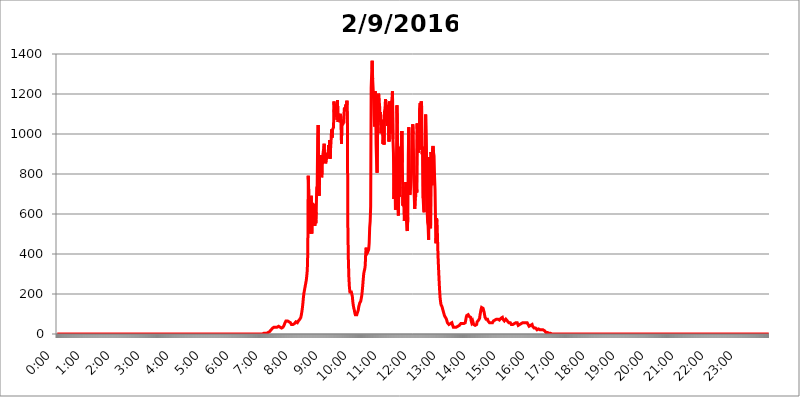
| Category | 2016.02.09 |
|---|---|
| 0.0 | 0 |
| 0.0006944444444444445 | 0 |
| 0.001388888888888889 | 0 |
| 0.0020833333333333333 | 0 |
| 0.002777777777777778 | 0 |
| 0.003472222222222222 | 0 |
| 0.004166666666666667 | 0 |
| 0.004861111111111111 | 0 |
| 0.005555555555555556 | 0 |
| 0.0062499999999999995 | 0 |
| 0.006944444444444444 | 0 |
| 0.007638888888888889 | 0 |
| 0.008333333333333333 | 0 |
| 0.009027777777777779 | 0 |
| 0.009722222222222222 | 0 |
| 0.010416666666666666 | 0 |
| 0.011111111111111112 | 0 |
| 0.011805555555555555 | 0 |
| 0.012499999999999999 | 0 |
| 0.013194444444444444 | 0 |
| 0.013888888888888888 | 0 |
| 0.014583333333333332 | 0 |
| 0.015277777777777777 | 0 |
| 0.015972222222222224 | 0 |
| 0.016666666666666666 | 0 |
| 0.017361111111111112 | 0 |
| 0.018055555555555557 | 0 |
| 0.01875 | 0 |
| 0.019444444444444445 | 0 |
| 0.02013888888888889 | 0 |
| 0.020833333333333332 | 0 |
| 0.02152777777777778 | 0 |
| 0.022222222222222223 | 0 |
| 0.02291666666666667 | 0 |
| 0.02361111111111111 | 0 |
| 0.024305555555555556 | 0 |
| 0.024999999999999998 | 0 |
| 0.025694444444444447 | 0 |
| 0.02638888888888889 | 0 |
| 0.027083333333333334 | 0 |
| 0.027777777777777776 | 0 |
| 0.02847222222222222 | 0 |
| 0.029166666666666664 | 0 |
| 0.029861111111111113 | 0 |
| 0.030555555555555555 | 0 |
| 0.03125 | 0 |
| 0.03194444444444445 | 0 |
| 0.03263888888888889 | 0 |
| 0.03333333333333333 | 0 |
| 0.034027777777777775 | 0 |
| 0.034722222222222224 | 0 |
| 0.035416666666666666 | 0 |
| 0.036111111111111115 | 0 |
| 0.03680555555555556 | 0 |
| 0.0375 | 0 |
| 0.03819444444444444 | 0 |
| 0.03888888888888889 | 0 |
| 0.03958333333333333 | 0 |
| 0.04027777777777778 | 0 |
| 0.04097222222222222 | 0 |
| 0.041666666666666664 | 0 |
| 0.042361111111111106 | 0 |
| 0.04305555555555556 | 0 |
| 0.043750000000000004 | 0 |
| 0.044444444444444446 | 0 |
| 0.04513888888888889 | 0 |
| 0.04583333333333334 | 0 |
| 0.04652777777777778 | 0 |
| 0.04722222222222222 | 0 |
| 0.04791666666666666 | 0 |
| 0.04861111111111111 | 0 |
| 0.049305555555555554 | 0 |
| 0.049999999999999996 | 0 |
| 0.05069444444444445 | 0 |
| 0.051388888888888894 | 0 |
| 0.052083333333333336 | 0 |
| 0.05277777777777778 | 0 |
| 0.05347222222222222 | 0 |
| 0.05416666666666667 | 0 |
| 0.05486111111111111 | 0 |
| 0.05555555555555555 | 0 |
| 0.05625 | 0 |
| 0.05694444444444444 | 0 |
| 0.057638888888888885 | 0 |
| 0.05833333333333333 | 0 |
| 0.05902777777777778 | 0 |
| 0.059722222222222225 | 0 |
| 0.06041666666666667 | 0 |
| 0.061111111111111116 | 0 |
| 0.06180555555555556 | 0 |
| 0.0625 | 0 |
| 0.06319444444444444 | 0 |
| 0.06388888888888888 | 0 |
| 0.06458333333333334 | 0 |
| 0.06527777777777778 | 0 |
| 0.06597222222222222 | 0 |
| 0.06666666666666667 | 0 |
| 0.06736111111111111 | 0 |
| 0.06805555555555555 | 0 |
| 0.06874999999999999 | 0 |
| 0.06944444444444443 | 0 |
| 0.07013888888888889 | 0 |
| 0.07083333333333333 | 0 |
| 0.07152777777777779 | 0 |
| 0.07222222222222223 | 0 |
| 0.07291666666666667 | 0 |
| 0.07361111111111111 | 0 |
| 0.07430555555555556 | 0 |
| 0.075 | 0 |
| 0.07569444444444444 | 0 |
| 0.0763888888888889 | 0 |
| 0.07708333333333334 | 0 |
| 0.07777777777777778 | 0 |
| 0.07847222222222222 | 0 |
| 0.07916666666666666 | 0 |
| 0.0798611111111111 | 0 |
| 0.08055555555555556 | 0 |
| 0.08125 | 0 |
| 0.08194444444444444 | 0 |
| 0.08263888888888889 | 0 |
| 0.08333333333333333 | 0 |
| 0.08402777777777777 | 0 |
| 0.08472222222222221 | 0 |
| 0.08541666666666665 | 0 |
| 0.08611111111111112 | 0 |
| 0.08680555555555557 | 0 |
| 0.08750000000000001 | 0 |
| 0.08819444444444445 | 0 |
| 0.08888888888888889 | 0 |
| 0.08958333333333333 | 0 |
| 0.09027777777777778 | 0 |
| 0.09097222222222222 | 0 |
| 0.09166666666666667 | 0 |
| 0.09236111111111112 | 0 |
| 0.09305555555555556 | 0 |
| 0.09375 | 0 |
| 0.09444444444444444 | 0 |
| 0.09513888888888888 | 0 |
| 0.09583333333333333 | 0 |
| 0.09652777777777777 | 0 |
| 0.09722222222222222 | 0 |
| 0.09791666666666667 | 0 |
| 0.09861111111111111 | 0 |
| 0.09930555555555555 | 0 |
| 0.09999999999999999 | 0 |
| 0.10069444444444443 | 0 |
| 0.1013888888888889 | 0 |
| 0.10208333333333335 | 0 |
| 0.10277777777777779 | 0 |
| 0.10347222222222223 | 0 |
| 0.10416666666666667 | 0 |
| 0.10486111111111111 | 0 |
| 0.10555555555555556 | 0 |
| 0.10625 | 0 |
| 0.10694444444444444 | 0 |
| 0.1076388888888889 | 0 |
| 0.10833333333333334 | 0 |
| 0.10902777777777778 | 0 |
| 0.10972222222222222 | 0 |
| 0.1111111111111111 | 0 |
| 0.11180555555555556 | 0 |
| 0.11180555555555556 | 0 |
| 0.1125 | 0 |
| 0.11319444444444444 | 0 |
| 0.11388888888888889 | 0 |
| 0.11458333333333333 | 0 |
| 0.11527777777777777 | 0 |
| 0.11597222222222221 | 0 |
| 0.11666666666666665 | 0 |
| 0.1173611111111111 | 0 |
| 0.11805555555555557 | 0 |
| 0.11944444444444445 | 0 |
| 0.12013888888888889 | 0 |
| 0.12083333333333333 | 0 |
| 0.12152777777777778 | 0 |
| 0.12222222222222223 | 0 |
| 0.12291666666666667 | 0 |
| 0.12291666666666667 | 0 |
| 0.12361111111111112 | 0 |
| 0.12430555555555556 | 0 |
| 0.125 | 0 |
| 0.12569444444444444 | 0 |
| 0.12638888888888888 | 0 |
| 0.12708333333333333 | 0 |
| 0.16875 | 0 |
| 0.12847222222222224 | 0 |
| 0.12916666666666668 | 0 |
| 0.12986111111111112 | 0 |
| 0.13055555555555556 | 0 |
| 0.13125 | 0 |
| 0.13194444444444445 | 0 |
| 0.1326388888888889 | 0 |
| 0.13333333333333333 | 0 |
| 0.13402777777777777 | 0 |
| 0.13402777777777777 | 0 |
| 0.13472222222222222 | 0 |
| 0.13541666666666666 | 0 |
| 0.1361111111111111 | 0 |
| 0.13749999999999998 | 0 |
| 0.13819444444444443 | 0 |
| 0.1388888888888889 | 0 |
| 0.13958333333333334 | 0 |
| 0.14027777777777778 | 0 |
| 0.14097222222222222 | 0 |
| 0.14166666666666666 | 0 |
| 0.1423611111111111 | 0 |
| 0.14305555555555557 | 0 |
| 0.14375000000000002 | 0 |
| 0.14444444444444446 | 0 |
| 0.1451388888888889 | 0 |
| 0.1451388888888889 | 0 |
| 0.14652777777777778 | 0 |
| 0.14722222222222223 | 0 |
| 0.14791666666666667 | 0 |
| 0.1486111111111111 | 0 |
| 0.14930555555555555 | 0 |
| 0.15 | 0 |
| 0.15069444444444444 | 0 |
| 0.15138888888888888 | 0 |
| 0.15208333333333332 | 0 |
| 0.15277777777777776 | 0 |
| 0.15347222222222223 | 0 |
| 0.15416666666666667 | 0 |
| 0.15486111111111112 | 0 |
| 0.15555555555555556 | 0 |
| 0.15625 | 0 |
| 0.15694444444444444 | 0 |
| 0.15763888888888888 | 0 |
| 0.15833333333333333 | 0 |
| 0.15902777777777777 | 0 |
| 0.15972222222222224 | 0 |
| 0.16041666666666668 | 0 |
| 0.16111111111111112 | 0 |
| 0.16180555555555556 | 0 |
| 0.1625 | 0 |
| 0.16319444444444445 | 0 |
| 0.1638888888888889 | 0 |
| 0.16458333333333333 | 0 |
| 0.16527777777777777 | 0 |
| 0.16597222222222222 | 0 |
| 0.16666666666666666 | 0 |
| 0.1673611111111111 | 0 |
| 0.16805555555555554 | 0 |
| 0.16874999999999998 | 0 |
| 0.16944444444444443 | 0 |
| 0.17013888888888887 | 0 |
| 0.1708333333333333 | 0 |
| 0.17152777777777775 | 0 |
| 0.17222222222222225 | 0 |
| 0.1729166666666667 | 0 |
| 0.17361111111111113 | 0 |
| 0.17430555555555557 | 0 |
| 0.17500000000000002 | 0 |
| 0.17569444444444446 | 0 |
| 0.1763888888888889 | 0 |
| 0.17708333333333334 | 0 |
| 0.17777777777777778 | 0 |
| 0.17847222222222223 | 0 |
| 0.17916666666666667 | 0 |
| 0.1798611111111111 | 0 |
| 0.18055555555555555 | 0 |
| 0.18125 | 0 |
| 0.18194444444444444 | 0 |
| 0.1826388888888889 | 0 |
| 0.18333333333333335 | 0 |
| 0.1840277777777778 | 0 |
| 0.18472222222222223 | 0 |
| 0.18541666666666667 | 0 |
| 0.18611111111111112 | 0 |
| 0.18680555555555556 | 0 |
| 0.1875 | 0 |
| 0.18819444444444444 | 0 |
| 0.18888888888888888 | 0 |
| 0.18958333333333333 | 0 |
| 0.19027777777777777 | 0 |
| 0.1909722222222222 | 0 |
| 0.19166666666666665 | 0 |
| 0.19236111111111112 | 0 |
| 0.19305555555555554 | 0 |
| 0.19375 | 0 |
| 0.19444444444444445 | 0 |
| 0.1951388888888889 | 0 |
| 0.19583333333333333 | 0 |
| 0.19652777777777777 | 0 |
| 0.19722222222222222 | 0 |
| 0.19791666666666666 | 0 |
| 0.1986111111111111 | 0 |
| 0.19930555555555554 | 0 |
| 0.19999999999999998 | 0 |
| 0.20069444444444443 | 0 |
| 0.20138888888888887 | 0 |
| 0.2020833333333333 | 0 |
| 0.2027777777777778 | 0 |
| 0.2034722222222222 | 0 |
| 0.2041666666666667 | 0 |
| 0.20486111111111113 | 0 |
| 0.20555555555555557 | 0 |
| 0.20625000000000002 | 0 |
| 0.20694444444444446 | 0 |
| 0.2076388888888889 | 0 |
| 0.20833333333333334 | 0 |
| 0.20902777777777778 | 0 |
| 0.20972222222222223 | 0 |
| 0.21041666666666667 | 0 |
| 0.2111111111111111 | 0 |
| 0.21180555555555555 | 0 |
| 0.2125 | 0 |
| 0.21319444444444444 | 0 |
| 0.2138888888888889 | 0 |
| 0.21458333333333335 | 0 |
| 0.2152777777777778 | 0 |
| 0.21597222222222223 | 0 |
| 0.21666666666666667 | 0 |
| 0.21736111111111112 | 0 |
| 0.21805555555555556 | 0 |
| 0.21875 | 0 |
| 0.21944444444444444 | 0 |
| 0.22013888888888888 | 0 |
| 0.22083333333333333 | 0 |
| 0.22152777777777777 | 0 |
| 0.2222222222222222 | 0 |
| 0.22291666666666665 | 0 |
| 0.2236111111111111 | 0 |
| 0.22430555555555556 | 0 |
| 0.225 | 0 |
| 0.22569444444444445 | 0 |
| 0.2263888888888889 | 0 |
| 0.22708333333333333 | 0 |
| 0.22777777777777777 | 0 |
| 0.22847222222222222 | 0 |
| 0.22916666666666666 | 0 |
| 0.2298611111111111 | 0 |
| 0.23055555555555554 | 0 |
| 0.23124999999999998 | 0 |
| 0.23194444444444443 | 0 |
| 0.23263888888888887 | 0 |
| 0.2333333333333333 | 0 |
| 0.2340277777777778 | 0 |
| 0.2347222222222222 | 0 |
| 0.2354166666666667 | 0 |
| 0.23611111111111113 | 0 |
| 0.23680555555555557 | 0 |
| 0.23750000000000002 | 0 |
| 0.23819444444444446 | 0 |
| 0.2388888888888889 | 0 |
| 0.23958333333333334 | 0 |
| 0.24027777777777778 | 0 |
| 0.24097222222222223 | 0 |
| 0.24166666666666667 | 0 |
| 0.2423611111111111 | 0 |
| 0.24305555555555555 | 0 |
| 0.24375 | 0 |
| 0.24444444444444446 | 0 |
| 0.24513888888888888 | 0 |
| 0.24583333333333335 | 0 |
| 0.2465277777777778 | 0 |
| 0.24722222222222223 | 0 |
| 0.24791666666666667 | 0 |
| 0.24861111111111112 | 0 |
| 0.24930555555555556 | 0 |
| 0.25 | 0 |
| 0.25069444444444444 | 0 |
| 0.2513888888888889 | 0 |
| 0.2520833333333333 | 0 |
| 0.25277777777777777 | 0 |
| 0.2534722222222222 | 0 |
| 0.25416666666666665 | 0 |
| 0.2548611111111111 | 0 |
| 0.2555555555555556 | 0 |
| 0.25625000000000003 | 0 |
| 0.2569444444444445 | 0 |
| 0.2576388888888889 | 0 |
| 0.25833333333333336 | 0 |
| 0.2590277777777778 | 0 |
| 0.25972222222222224 | 0 |
| 0.2604166666666667 | 0 |
| 0.2611111111111111 | 0 |
| 0.26180555555555557 | 0 |
| 0.2625 | 0 |
| 0.26319444444444445 | 0 |
| 0.2638888888888889 | 0 |
| 0.26458333333333334 | 0 |
| 0.2652777777777778 | 0 |
| 0.2659722222222222 | 0 |
| 0.26666666666666666 | 0 |
| 0.2673611111111111 | 0 |
| 0.26805555555555555 | 0 |
| 0.26875 | 0 |
| 0.26944444444444443 | 0 |
| 0.2701388888888889 | 0 |
| 0.2708333333333333 | 0 |
| 0.27152777777777776 | 0 |
| 0.2722222222222222 | 0 |
| 0.27291666666666664 | 0 |
| 0.2736111111111111 | 0 |
| 0.2743055555555555 | 0 |
| 0.27499999999999997 | 0 |
| 0.27569444444444446 | 0 |
| 0.27638888888888885 | 0 |
| 0.27708333333333335 | 0 |
| 0.2777777777777778 | 0 |
| 0.27847222222222223 | 0 |
| 0.2791666666666667 | 0 |
| 0.2798611111111111 | 0 |
| 0.28055555555555556 | 0 |
| 0.28125 | 0 |
| 0.28194444444444444 | 0 |
| 0.2826388888888889 | 0 |
| 0.2833333333333333 | 0 |
| 0.28402777777777777 | 0 |
| 0.2847222222222222 | 0 |
| 0.28541666666666665 | 0 |
| 0.28611111111111115 | 0 |
| 0.28680555555555554 | 0 |
| 0.28750000000000003 | 0 |
| 0.2881944444444445 | 0 |
| 0.2888888888888889 | 0 |
| 0.28958333333333336 | 3.525 |
| 0.2902777777777778 | 3.525 |
| 0.29097222222222224 | 3.525 |
| 0.2916666666666667 | 3.525 |
| 0.2923611111111111 | 3.525 |
| 0.29305555555555557 | 3.525 |
| 0.29375 | 3.525 |
| 0.29444444444444445 | 7.887 |
| 0.2951388888888889 | 7.887 |
| 0.29583333333333334 | 7.887 |
| 0.2965277777777778 | 12.257 |
| 0.2972222222222222 | 12.257 |
| 0.29791666666666666 | 12.257 |
| 0.2986111111111111 | 16.636 |
| 0.29930555555555555 | 16.636 |
| 0.3 | 21.024 |
| 0.30069444444444443 | 21.024 |
| 0.3013888888888889 | 25.419 |
| 0.3020833333333333 | 29.823 |
| 0.30277777777777776 | 29.823 |
| 0.3034722222222222 | 34.234 |
| 0.30416666666666664 | 34.234 |
| 0.3048611111111111 | 34.234 |
| 0.3055555555555555 | 34.234 |
| 0.30624999999999997 | 34.234 |
| 0.3069444444444444 | 34.234 |
| 0.3076388888888889 | 34.234 |
| 0.30833333333333335 | 34.234 |
| 0.3090277777777778 | 38.653 |
| 0.30972222222222223 | 38.653 |
| 0.3104166666666667 | 38.653 |
| 0.3111111111111111 | 38.653 |
| 0.31180555555555556 | 38.653 |
| 0.3125 | 34.234 |
| 0.31319444444444444 | 29.823 |
| 0.3138888888888889 | 29.823 |
| 0.3145833333333333 | 29.823 |
| 0.31527777777777777 | 29.823 |
| 0.3159722222222222 | 34.234 |
| 0.31666666666666665 | 34.234 |
| 0.31736111111111115 | 38.653 |
| 0.31805555555555554 | 43.079 |
| 0.31875000000000003 | 47.511 |
| 0.3194444444444445 | 56.398 |
| 0.3201388888888889 | 60.85 |
| 0.32083333333333336 | 65.31 |
| 0.3215277777777778 | 65.31 |
| 0.32222222222222224 | 65.31 |
| 0.3229166666666667 | 65.31 |
| 0.3236111111111111 | 65.31 |
| 0.32430555555555557 | 60.85 |
| 0.325 | 60.85 |
| 0.32569444444444445 | 60.85 |
| 0.3263888888888889 | 56.398 |
| 0.32708333333333334 | 56.398 |
| 0.3277777777777778 | 51.951 |
| 0.3284722222222222 | 47.511 |
| 0.32916666666666666 | 47.511 |
| 0.3298611111111111 | 47.511 |
| 0.33055555555555555 | 47.511 |
| 0.33125 | 47.511 |
| 0.33194444444444443 | 47.511 |
| 0.3326388888888889 | 51.951 |
| 0.3333333333333333 | 51.951 |
| 0.3340277777777778 | 56.398 |
| 0.3347222222222222 | 60.85 |
| 0.3354166666666667 | 60.85 |
| 0.3361111111111111 | 60.85 |
| 0.3368055555555556 | 56.398 |
| 0.33749999999999997 | 56.398 |
| 0.33819444444444446 | 65.31 |
| 0.33888888888888885 | 69.775 |
| 0.33958333333333335 | 69.775 |
| 0.34027777777777773 | 74.246 |
| 0.34097222222222223 | 78.722 |
| 0.3416666666666666 | 83.205 |
| 0.3423611111111111 | 96.682 |
| 0.3430555555555555 | 110.201 |
| 0.34375 | 128.284 |
| 0.3444444444444445 | 150.964 |
| 0.3451388888888889 | 178.264 |
| 0.3458333333333334 | 201.058 |
| 0.34652777777777777 | 214.746 |
| 0.34722222222222227 | 228.436 |
| 0.34791666666666665 | 242.127 |
| 0.34861111111111115 | 255.813 |
| 0.34930555555555554 | 269.49 |
| 0.35000000000000003 | 292.259 |
| 0.3506944444444444 | 319.517 |
| 0.3513888888888889 | 409.574 |
| 0.3520833333333333 | 791.169 |
| 0.3527777777777778 | 695.666 |
| 0.3534722222222222 | 625.784 |
| 0.3541666666666667 | 502.192 |
| 0.3548611111111111 | 528.2 |
| 0.35555555555555557 | 571.049 |
| 0.35625 | 691.608 |
| 0.35694444444444445 | 502.192 |
| 0.3576388888888889 | 654.791 |
| 0.35833333333333334 | 642.4 |
| 0.3590277777777778 | 553.986 |
| 0.3597222222222222 | 604.864 |
| 0.36041666666666666 | 613.252 |
| 0.3611111111111111 | 541.121 |
| 0.36180555555555555 | 650.667 |
| 0.3625 | 553.986 |
| 0.36319444444444443 | 609.062 |
| 0.3638888888888889 | 731.896 |
| 0.3645833333333333 | 739.877 |
| 0.3652777777777778 | 977.508 |
| 0.3659722222222222 | 1044.762 |
| 0.3666666666666667 | 791.169 |
| 0.3673611111111111 | 691.608 |
| 0.3680555555555556 | 826.123 |
| 0.36874999999999997 | 868.305 |
| 0.36944444444444446 | 894.885 |
| 0.37013888888888885 | 826.123 |
| 0.37083333333333335 | 783.342 |
| 0.37152777777777773 | 814.519 |
| 0.37222222222222223 | 887.309 |
| 0.3729166666666666 | 891.099 |
| 0.3736111111111111 | 925.06 |
| 0.3743055555555555 | 951.327 |
| 0.375 | 891.099 |
| 0.3756944444444445 | 872.114 |
| 0.3763888888888889 | 853.029 |
| 0.3770833333333334 | 868.305 |
| 0.37777777777777777 | 875.918 |
| 0.37847222222222227 | 906.223 |
| 0.37916666666666665 | 883.516 |
| 0.37986111111111115 | 891.099 |
| 0.38055555555555554 | 943.832 |
| 0.38125000000000003 | 887.309 |
| 0.3819444444444444 | 970.034 |
| 0.3826388888888889 | 875.918 |
| 0.3833333333333333 | 925.06 |
| 0.3840277777777778 | 962.555 |
| 0.3847222222222222 | 1022.323 |
| 0.3854166666666667 | 981.244 |
| 0.3861111111111111 | 1022.323 |
| 0.38680555555555557 | 1018.587 |
| 0.3875 | 1033.537 |
| 0.38819444444444445 | 1162.571 |
| 0.3888888888888889 | 1086.097 |
| 0.38958333333333334 | 1108.816 |
| 0.3902777777777778 | 1101.226 |
| 0.3909722222222222 | 1150.946 |
| 0.39166666666666666 | 1143.232 |
| 0.3923611111111111 | 1071.027 |
| 0.39305555555555555 | 1170.358 |
| 0.39375 | 1059.756 |
| 0.39444444444444443 | 1059.756 |
| 0.3951388888888889 | 1074.789 |
| 0.3958333333333333 | 1078.555 |
| 0.3965277777777778 | 1093.653 |
| 0.3972222222222222 | 1101.226 |
| 0.3979166666666667 | 1056.004 |
| 0.3986111111111111 | 951.327 |
| 0.3993055555555556 | 1063.51 |
| 0.39999999999999997 | 1044.762 |
| 0.40069444444444446 | 1048.508 |
| 0.40138888888888885 | 1059.756 |
| 0.40208333333333335 | 1056.004 |
| 0.40277777777777773 | 1131.708 |
| 0.40347222222222223 | 1116.426 |
| 0.4041666666666666 | 1112.618 |
| 0.4048611111111111 | 1147.086 |
| 0.4055555555555555 | 1127.879 |
| 0.40625 | 1166.46 |
| 0.4069444444444445 | 1048.508 |
| 0.4076388888888889 | 515.223 |
| 0.4083333333333334 | 369.23 |
| 0.40902777777777777 | 283.156 |
| 0.40972222222222227 | 237.564 |
| 0.41041666666666665 | 210.182 |
| 0.41111111111111115 | 210.182 |
| 0.41180555555555554 | 214.746 |
| 0.41250000000000003 | 210.182 |
| 0.4131944444444444 | 205.62 |
| 0.4138888888888889 | 187.378 |
| 0.4145833333333333 | 160.056 |
| 0.4152777777777778 | 141.884 |
| 0.4159722222222222 | 128.284 |
| 0.4166666666666667 | 119.235 |
| 0.4173611111111111 | 105.69 |
| 0.41805555555555557 | 96.682 |
| 0.41875 | 92.184 |
| 0.41944444444444445 | 96.682 |
| 0.4201388888888889 | 96.682 |
| 0.42083333333333334 | 105.69 |
| 0.4215277777777778 | 110.201 |
| 0.4222222222222222 | 119.235 |
| 0.42291666666666666 | 137.347 |
| 0.4236111111111111 | 146.423 |
| 0.42430555555555555 | 155.509 |
| 0.425 | 155.509 |
| 0.42569444444444443 | 164.605 |
| 0.4263888888888889 | 178.264 |
| 0.4270833333333333 | 191.937 |
| 0.4277777777777778 | 214.746 |
| 0.4284722222222222 | 242.127 |
| 0.4291666666666667 | 274.047 |
| 0.4298611111111111 | 301.354 |
| 0.4305555555555556 | 314.98 |
| 0.43124999999999997 | 324.052 |
| 0.43194444444444446 | 342.162 |
| 0.43263888888888885 | 405.108 |
| 0.43333333333333335 | 431.833 |
| 0.43402777777777773 | 400.638 |
| 0.43472222222222223 | 405.108 |
| 0.4354166666666666 | 409.574 |
| 0.4361111111111111 | 409.574 |
| 0.4368055555555555 | 422.943 |
| 0.4375 | 453.968 |
| 0.4381944444444445 | 532.513 |
| 0.4388888888888889 | 562.53 |
| 0.4395833333333334 | 638.256 |
| 0.44027777777777777 | 1229.899 |
| 0.44097222222222227 | 1300.514 |
| 0.44166666666666665 | 1366.519 |
| 0.44236111111111115 | 1275.142 |
| 0.44305555555555554 | 1225.859 |
| 0.44375000000000003 | 1166.46 |
| 0.4444444444444444 | 1089.873 |
| 0.4451388888888889 | 1037.277 |
| 0.4458333333333333 | 1213.804 |
| 0.4465277777777778 | 1166.46 |
| 0.4472222222222222 | 947.58 |
| 0.4479166666666667 | 860.676 |
| 0.4486111111111111 | 806.757 |
| 0.44930555555555557 | 1033.537 |
| 0.45 | 1135.543 |
| 0.45069444444444445 | 1201.843 |
| 0.4513888888888889 | 1162.571 |
| 0.45208333333333334 | 1147.086 |
| 0.4527777777777778 | 1059.756 |
| 0.4534722222222222 | 1108.816 |
| 0.45416666666666666 | 1003.65 |
| 0.4548611111111111 | 1048.508 |
| 0.45555555555555555 | 1014.852 |
| 0.45625 | 1071.027 |
| 0.45694444444444443 | 951.327 |
| 0.4576388888888889 | 981.244 |
| 0.4583333333333333 | 947.58 |
| 0.4590277777777778 | 1112.618 |
| 0.4597222222222222 | 1127.879 |
| 0.4604166666666667 | 1174.263 |
| 0.4611111111111111 | 1150.946 |
| 0.4618055555555556 | 1143.232 |
| 0.46249999999999997 | 1086.097 |
| 0.46319444444444446 | 1041.019 |
| 0.46388888888888885 | 1063.51 |
| 0.46458333333333335 | 1101.226 |
| 0.46527777777777773 | 962.555 |
| 0.46597222222222223 | 1162.571 |
| 0.4666666666666666 | 999.916 |
| 0.4673611111111111 | 1037.277 |
| 0.4680555555555555 | 1147.086 |
| 0.46875 | 1124.056 |
| 0.4694444444444445 | 1170.358 |
| 0.4701388888888889 | 1213.804 |
| 0.4708333333333334 | 973.772 |
| 0.47152777777777777 | 906.223 |
| 0.47222222222222227 | 675.311 |
| 0.47291666666666665 | 853.029 |
| 0.47361111111111115 | 810.641 |
| 0.47430555555555554 | 621.613 |
| 0.47500000000000003 | 654.791 |
| 0.4756944444444444 | 818.392 |
| 0.4763888888888889 | 1143.232 |
| 0.4770833333333333 | 1052.255 |
| 0.4777777777777778 | 642.4 |
| 0.4784722222222222 | 592.233 |
| 0.4791666666666667 | 798.974 |
| 0.4798611111111111 | 687.544 |
| 0.48055555555555557 | 814.519 |
| 0.48125 | 936.33 |
| 0.48194444444444445 | 856.855 |
| 0.4826388888888889 | 860.676 |
| 0.48333333333333334 | 1014.852 |
| 0.4840277777777778 | 856.855 |
| 0.4847222222222222 | 642.4 |
| 0.48541666666666666 | 735.89 |
| 0.4861111111111111 | 638.256 |
| 0.48680555555555555 | 566.793 |
| 0.4875 | 600.661 |
| 0.48819444444444443 | 687.544 |
| 0.4888888888888889 | 759.723 |
| 0.4895833333333333 | 588.009 |
| 0.4902777777777778 | 528.2 |
| 0.4909722222222222 | 515.223 |
| 0.4916666666666667 | 583.779 |
| 0.4923611111111111 | 894.885 |
| 0.4930555555555556 | 1033.537 |
| 0.49374999999999997 | 743.859 |
| 0.49444444444444446 | 695.666 |
| 0.49513888888888885 | 707.8 |
| 0.49583333333333335 | 747.834 |
| 0.49652777777777773 | 751.803 |
| 0.49722222222222223 | 833.834 |
| 0.4979166666666666 | 1003.65 |
| 0.4986111111111111 | 1048.508 |
| 0.4993055555555555 | 999.916 |
| 0.5 | 798.974 |
| 0.5006944444444444 | 687.544 |
| 0.5013888888888889 | 625.784 |
| 0.5020833333333333 | 679.395 |
| 0.5027777777777778 | 687.544 |
| 0.5034722222222222 | 791.169 |
| 0.5041666666666667 | 707.8 |
| 0.5048611111111111 | 1052.255 |
| 0.5055555555555555 | 973.772 |
| 0.50625 | 906.223 |
| 0.5069444444444444 | 996.182 |
| 0.5076388888888889 | 921.298 |
| 0.5083333333333333 | 1127.879 |
| 0.5090277777777777 | 1154.814 |
| 0.5097222222222222 | 1078.555 |
| 0.5104166666666666 | 1162.571 |
| 0.5111111111111112 | 1135.543 |
| 0.5118055555555555 | 898.668 |
| 0.5125000000000001 | 936.33 |
| 0.5131944444444444 | 679.395 |
| 0.513888888888889 | 625.784 |
| 0.5145833333333333 | 609.062 |
| 0.5152777777777778 | 806.757 |
| 0.5159722222222222 | 902.447 |
| 0.5166666666666667 | 1097.437 |
| 0.517361111111111 | 1101.226 |
| 0.5180555555555556 | 837.682 |
| 0.5187499999999999 | 625.784 |
| 0.5194444444444445 | 558.261 |
| 0.5201388888888888 | 541.121 |
| 0.5208333333333334 | 471.582 |
| 0.5215277777777778 | 883.516 |
| 0.5222222222222223 | 600.661 |
| 0.5229166666666667 | 575.299 |
| 0.5236111111111111 | 528.2 |
| 0.5243055555555556 | 909.996 |
| 0.525 | 829.981 |
| 0.5256944444444445 | 743.859 |
| 0.5263888888888889 | 928.819 |
| 0.5270833333333333 | 940.082 |
| 0.5277777777777778 | 906.223 |
| 0.5284722222222222 | 891.099 |
| 0.5291666666666667 | 787.258 |
| 0.5298611111111111 | 723.889 |
| 0.5305555555555556 | 566.793 |
| 0.53125 | 453.968 |
| 0.5319444444444444 | 579.542 |
| 0.5326388888888889 | 562.53 |
| 0.5333333333333333 | 480.356 |
| 0.5340277777777778 | 391.685 |
| 0.5347222222222222 | 333.113 |
| 0.5354166666666667 | 278.603 |
| 0.5361111111111111 | 228.436 |
| 0.5368055555555555 | 187.378 |
| 0.5375 | 164.605 |
| 0.5381944444444444 | 146.423 |
| 0.5388888888888889 | 141.884 |
| 0.5395833333333333 | 137.347 |
| 0.5402777777777777 | 128.284 |
| 0.5409722222222222 | 119.235 |
| 0.5416666666666666 | 110.201 |
| 0.5423611111111112 | 101.184 |
| 0.5430555555555555 | 92.184 |
| 0.5437500000000001 | 87.692 |
| 0.5444444444444444 | 83.205 |
| 0.545138888888889 | 78.722 |
| 0.5458333333333333 | 74.246 |
| 0.5465277777777778 | 65.31 |
| 0.5472222222222222 | 56.398 |
| 0.5479166666666667 | 51.951 |
| 0.548611111111111 | 51.951 |
| 0.5493055555555556 | 47.511 |
| 0.5499999999999999 | 47.511 |
| 0.5506944444444445 | 47.511 |
| 0.5513888888888888 | 51.951 |
| 0.5520833333333334 | 51.951 |
| 0.5527777777777778 | 51.951 |
| 0.5534722222222223 | 56.398 |
| 0.5541666666666667 | 47.511 |
| 0.5548611111111111 | 43.079 |
| 0.5555555555555556 | 34.234 |
| 0.55625 | 29.823 |
| 0.5569444444444445 | 34.234 |
| 0.5576388888888889 | 34.234 |
| 0.5583333333333333 | 38.653 |
| 0.5590277777777778 | 34.234 |
| 0.5597222222222222 | 34.234 |
| 0.5604166666666667 | 34.234 |
| 0.5611111111111111 | 38.653 |
| 0.5618055555555556 | 38.653 |
| 0.5625 | 38.653 |
| 0.5631944444444444 | 38.653 |
| 0.5638888888888889 | 43.079 |
| 0.5645833333333333 | 43.079 |
| 0.5652777777777778 | 47.511 |
| 0.5659722222222222 | 51.951 |
| 0.5666666666666667 | 51.951 |
| 0.5673611111111111 | 51.951 |
| 0.5680555555555555 | 51.951 |
| 0.56875 | 51.951 |
| 0.5694444444444444 | 56.398 |
| 0.5701388888888889 | 51.951 |
| 0.5708333333333333 | 51.951 |
| 0.5715277777777777 | 51.951 |
| 0.5722222222222222 | 56.398 |
| 0.5729166666666666 | 69.775 |
| 0.5736111111111112 | 83.205 |
| 0.5743055555555555 | 92.184 |
| 0.5750000000000001 | 96.682 |
| 0.5756944444444444 | 96.682 |
| 0.576388888888889 | 96.682 |
| 0.5770833333333333 | 92.184 |
| 0.5777777777777778 | 87.692 |
| 0.5784722222222222 | 92.184 |
| 0.5791666666666667 | 92.184 |
| 0.579861111111111 | 83.205 |
| 0.5805555555555556 | 65.31 |
| 0.5812499999999999 | 56.398 |
| 0.5819444444444445 | 60.85 |
| 0.5826388888888888 | 65.31 |
| 0.5833333333333334 | 56.398 |
| 0.5840277777777778 | 47.511 |
| 0.5847222222222223 | 47.511 |
| 0.5854166666666667 | 47.511 |
| 0.5861111111111111 | 43.079 |
| 0.5868055555555556 | 43.079 |
| 0.5875 | 43.079 |
| 0.5881944444444445 | 47.511 |
| 0.5888888888888889 | 60.85 |
| 0.5895833333333333 | 65.31 |
| 0.5902777777777778 | 65.31 |
| 0.5909722222222222 | 69.775 |
| 0.5916666666666667 | 74.246 |
| 0.5923611111111111 | 78.722 |
| 0.5930555555555556 | 96.682 |
| 0.59375 | 110.201 |
| 0.5944444444444444 | 123.758 |
| 0.5951388888888889 | 132.814 |
| 0.5958333333333333 | 137.347 |
| 0.5965277777777778 | 128.284 |
| 0.5972222222222222 | 128.284 |
| 0.5979166666666667 | 119.235 |
| 0.5986111111111111 | 110.201 |
| 0.5993055555555555 | 96.682 |
| 0.6 | 83.205 |
| 0.6006944444444444 | 78.722 |
| 0.6013888888888889 | 74.246 |
| 0.6020833333333333 | 78.722 |
| 0.6027777777777777 | 78.722 |
| 0.6034722222222222 | 74.246 |
| 0.6041666666666666 | 65.31 |
| 0.6048611111111112 | 60.85 |
| 0.6055555555555555 | 60.85 |
| 0.6062500000000001 | 56.398 |
| 0.6069444444444444 | 51.951 |
| 0.607638888888889 | 51.951 |
| 0.6083333333333333 | 56.398 |
| 0.6090277777777778 | 56.398 |
| 0.6097222222222222 | 56.398 |
| 0.6104166666666667 | 56.398 |
| 0.611111111111111 | 60.85 |
| 0.6118055555555556 | 65.31 |
| 0.6124999999999999 | 65.31 |
| 0.6131944444444445 | 69.775 |
| 0.6138888888888888 | 69.775 |
| 0.6145833333333334 | 69.775 |
| 0.6152777777777778 | 74.246 |
| 0.6159722222222223 | 74.246 |
| 0.6166666666666667 | 74.246 |
| 0.6173611111111111 | 74.246 |
| 0.6180555555555556 | 74.246 |
| 0.61875 | 74.246 |
| 0.6194444444444445 | 74.246 |
| 0.6201388888888889 | 69.775 |
| 0.6208333333333333 | 74.246 |
| 0.6215277777777778 | 74.246 |
| 0.6222222222222222 | 78.722 |
| 0.6229166666666667 | 83.205 |
| 0.6236111111111111 | 83.205 |
| 0.6243055555555556 | 83.205 |
| 0.625 | 74.246 |
| 0.6256944444444444 | 69.775 |
| 0.6263888888888889 | 69.775 |
| 0.6270833333333333 | 65.31 |
| 0.6277777777777778 | 69.775 |
| 0.6284722222222222 | 69.775 |
| 0.6291666666666667 | 74.246 |
| 0.6298611111111111 | 74.246 |
| 0.6305555555555555 | 69.775 |
| 0.63125 | 65.31 |
| 0.6319444444444444 | 65.31 |
| 0.6326388888888889 | 60.85 |
| 0.6333333333333333 | 56.398 |
| 0.6340277777777777 | 60.85 |
| 0.6347222222222222 | 56.398 |
| 0.6354166666666666 | 56.398 |
| 0.6361111111111112 | 51.951 |
| 0.6368055555555555 | 47.511 |
| 0.6375000000000001 | 47.511 |
| 0.6381944444444444 | 43.079 |
| 0.638888888888889 | 47.511 |
| 0.6395833333333333 | 47.511 |
| 0.6402777777777778 | 47.511 |
| 0.6409722222222222 | 51.951 |
| 0.6416666666666667 | 51.951 |
| 0.642361111111111 | 56.398 |
| 0.6430555555555556 | 56.398 |
| 0.6437499999999999 | 56.398 |
| 0.6444444444444445 | 56.398 |
| 0.6451388888888888 | 56.398 |
| 0.6458333333333334 | 51.951 |
| 0.6465277777777778 | 43.079 |
| 0.6472222222222223 | 38.653 |
| 0.6479166666666667 | 43.079 |
| 0.6486111111111111 | 47.511 |
| 0.6493055555555556 | 51.951 |
| 0.65 | 51.951 |
| 0.6506944444444445 | 51.951 |
| 0.6513888888888889 | 47.511 |
| 0.6520833333333333 | 47.511 |
| 0.6527777777777778 | 56.398 |
| 0.6534722222222222 | 60.85 |
| 0.6541666666666667 | 60.85 |
| 0.6548611111111111 | 56.398 |
| 0.6555555555555556 | 56.398 |
| 0.65625 | 56.398 |
| 0.6569444444444444 | 56.398 |
| 0.6576388888888889 | 56.398 |
| 0.6583333333333333 | 60.85 |
| 0.6590277777777778 | 56.398 |
| 0.6597222222222222 | 51.951 |
| 0.6604166666666667 | 47.511 |
| 0.6611111111111111 | 43.079 |
| 0.6618055555555555 | 38.653 |
| 0.6625 | 38.653 |
| 0.6631944444444444 | 43.079 |
| 0.6638888888888889 | 43.079 |
| 0.6645833333333333 | 47.511 |
| 0.6652777777777777 | 47.511 |
| 0.6659722222222222 | 47.511 |
| 0.6666666666666666 | 38.653 |
| 0.6673611111111111 | 38.653 |
| 0.6680555555555556 | 34.234 |
| 0.6687500000000001 | 29.823 |
| 0.6694444444444444 | 29.823 |
| 0.6701388888888888 | 29.823 |
| 0.6708333333333334 | 29.823 |
| 0.6715277777777778 | 29.823 |
| 0.6722222222222222 | 25.419 |
| 0.6729166666666666 | 21.024 |
| 0.6736111111111112 | 21.024 |
| 0.6743055555555556 | 21.024 |
| 0.6749999999999999 | 25.419 |
| 0.6756944444444444 | 21.024 |
| 0.6763888888888889 | 21.024 |
| 0.6770833333333334 | 21.024 |
| 0.6777777777777777 | 21.024 |
| 0.6784722222222223 | 21.024 |
| 0.6791666666666667 | 21.024 |
| 0.6798611111111111 | 21.024 |
| 0.6805555555555555 | 21.024 |
| 0.68125 | 21.024 |
| 0.6819444444444445 | 21.024 |
| 0.6826388888888889 | 16.636 |
| 0.6833333333333332 | 16.636 |
| 0.6840277777777778 | 12.257 |
| 0.6847222222222222 | 12.257 |
| 0.6854166666666667 | 7.887 |
| 0.686111111111111 | 7.887 |
| 0.6868055555555556 | 7.887 |
| 0.6875 | 7.887 |
| 0.6881944444444444 | 7.887 |
| 0.688888888888889 | 7.887 |
| 0.6895833333333333 | 3.525 |
| 0.6902777777777778 | 3.525 |
| 0.6909722222222222 | 3.525 |
| 0.6916666666666668 | 3.525 |
| 0.6923611111111111 | 3.525 |
| 0.6930555555555555 | 0 |
| 0.69375 | 0 |
| 0.6944444444444445 | 0 |
| 0.6951388888888889 | 0 |
| 0.6958333333333333 | 0 |
| 0.6965277777777777 | 0 |
| 0.6972222222222223 | 0 |
| 0.6979166666666666 | 0 |
| 0.6986111111111111 | 0 |
| 0.6993055555555556 | 0 |
| 0.7000000000000001 | 0 |
| 0.7006944444444444 | 0 |
| 0.7013888888888888 | 0 |
| 0.7020833333333334 | 0 |
| 0.7027777777777778 | 0 |
| 0.7034722222222222 | 0 |
| 0.7041666666666666 | 0 |
| 0.7048611111111112 | 0 |
| 0.7055555555555556 | 0 |
| 0.7062499999999999 | 0 |
| 0.7069444444444444 | 0 |
| 0.7076388888888889 | 0 |
| 0.7083333333333334 | 0 |
| 0.7090277777777777 | 0 |
| 0.7097222222222223 | 0 |
| 0.7104166666666667 | 0 |
| 0.7111111111111111 | 0 |
| 0.7118055555555555 | 0 |
| 0.7125 | 0 |
| 0.7131944444444445 | 0 |
| 0.7138888888888889 | 0 |
| 0.7145833333333332 | 0 |
| 0.7152777777777778 | 0 |
| 0.7159722222222222 | 0 |
| 0.7166666666666667 | 0 |
| 0.717361111111111 | 0 |
| 0.7180555555555556 | 0 |
| 0.71875 | 0 |
| 0.7194444444444444 | 0 |
| 0.720138888888889 | 0 |
| 0.7208333333333333 | 0 |
| 0.7215277777777778 | 0 |
| 0.7222222222222222 | 0 |
| 0.7229166666666668 | 0 |
| 0.7236111111111111 | 0 |
| 0.7243055555555555 | 0 |
| 0.725 | 0 |
| 0.7256944444444445 | 0 |
| 0.7263888888888889 | 0 |
| 0.7270833333333333 | 0 |
| 0.7277777777777777 | 0 |
| 0.7284722222222223 | 0 |
| 0.7291666666666666 | 0 |
| 0.7298611111111111 | 0 |
| 0.7305555555555556 | 0 |
| 0.7312500000000001 | 0 |
| 0.7319444444444444 | 0 |
| 0.7326388888888888 | 0 |
| 0.7333333333333334 | 0 |
| 0.7340277777777778 | 0 |
| 0.7347222222222222 | 0 |
| 0.7354166666666666 | 0 |
| 0.7361111111111112 | 0 |
| 0.7368055555555556 | 0 |
| 0.7374999999999999 | 0 |
| 0.7381944444444444 | 0 |
| 0.7388888888888889 | 0 |
| 0.7395833333333334 | 0 |
| 0.7402777777777777 | 0 |
| 0.7409722222222223 | 0 |
| 0.7416666666666667 | 0 |
| 0.7423611111111111 | 0 |
| 0.7430555555555555 | 0 |
| 0.74375 | 0 |
| 0.7444444444444445 | 0 |
| 0.7451388888888889 | 0 |
| 0.7458333333333332 | 0 |
| 0.7465277777777778 | 0 |
| 0.7472222222222222 | 0 |
| 0.7479166666666667 | 0 |
| 0.748611111111111 | 0 |
| 0.7493055555555556 | 0 |
| 0.75 | 0 |
| 0.7506944444444444 | 0 |
| 0.751388888888889 | 0 |
| 0.7520833333333333 | 0 |
| 0.7527777777777778 | 0 |
| 0.7534722222222222 | 0 |
| 0.7541666666666668 | 0 |
| 0.7548611111111111 | 0 |
| 0.7555555555555555 | 0 |
| 0.75625 | 0 |
| 0.7569444444444445 | 0 |
| 0.7576388888888889 | 0 |
| 0.7583333333333333 | 0 |
| 0.7590277777777777 | 0 |
| 0.7597222222222223 | 0 |
| 0.7604166666666666 | 0 |
| 0.7611111111111111 | 0 |
| 0.7618055555555556 | 0 |
| 0.7625000000000001 | 0 |
| 0.7631944444444444 | 0 |
| 0.7638888888888888 | 0 |
| 0.7645833333333334 | 0 |
| 0.7652777777777778 | 0 |
| 0.7659722222222222 | 0 |
| 0.7666666666666666 | 0 |
| 0.7673611111111112 | 0 |
| 0.7680555555555556 | 0 |
| 0.7687499999999999 | 0 |
| 0.7694444444444444 | 0 |
| 0.7701388888888889 | 0 |
| 0.7708333333333334 | 0 |
| 0.7715277777777777 | 0 |
| 0.7722222222222223 | 0 |
| 0.7729166666666667 | 0 |
| 0.7736111111111111 | 0 |
| 0.7743055555555555 | 0 |
| 0.775 | 0 |
| 0.7756944444444445 | 0 |
| 0.7763888888888889 | 0 |
| 0.7770833333333332 | 0 |
| 0.7777777777777778 | 0 |
| 0.7784722222222222 | 0 |
| 0.7791666666666667 | 0 |
| 0.779861111111111 | 0 |
| 0.7805555555555556 | 0 |
| 0.78125 | 0 |
| 0.7819444444444444 | 0 |
| 0.782638888888889 | 0 |
| 0.7833333333333333 | 0 |
| 0.7840277777777778 | 0 |
| 0.7847222222222222 | 0 |
| 0.7854166666666668 | 0 |
| 0.7861111111111111 | 0 |
| 0.7868055555555555 | 0 |
| 0.7875 | 0 |
| 0.7881944444444445 | 0 |
| 0.7888888888888889 | 0 |
| 0.7895833333333333 | 0 |
| 0.7902777777777777 | 0 |
| 0.7909722222222223 | 0 |
| 0.7916666666666666 | 0 |
| 0.7923611111111111 | 0 |
| 0.7930555555555556 | 0 |
| 0.7937500000000001 | 0 |
| 0.7944444444444444 | 0 |
| 0.7951388888888888 | 0 |
| 0.7958333333333334 | 0 |
| 0.7965277777777778 | 0 |
| 0.7972222222222222 | 0 |
| 0.7979166666666666 | 0 |
| 0.7986111111111112 | 0 |
| 0.7993055555555556 | 0 |
| 0.7999999999999999 | 0 |
| 0.8006944444444444 | 0 |
| 0.8013888888888889 | 0 |
| 0.8020833333333334 | 0 |
| 0.8027777777777777 | 0 |
| 0.8034722222222223 | 0 |
| 0.8041666666666667 | 0 |
| 0.8048611111111111 | 0 |
| 0.8055555555555555 | 0 |
| 0.80625 | 0 |
| 0.8069444444444445 | 0 |
| 0.8076388888888889 | 0 |
| 0.8083333333333332 | 0 |
| 0.8090277777777778 | 0 |
| 0.8097222222222222 | 0 |
| 0.8104166666666667 | 0 |
| 0.811111111111111 | 0 |
| 0.8118055555555556 | 0 |
| 0.8125 | 0 |
| 0.8131944444444444 | 0 |
| 0.813888888888889 | 0 |
| 0.8145833333333333 | 0 |
| 0.8152777777777778 | 0 |
| 0.8159722222222222 | 0 |
| 0.8166666666666668 | 0 |
| 0.8173611111111111 | 0 |
| 0.8180555555555555 | 0 |
| 0.81875 | 0 |
| 0.8194444444444445 | 0 |
| 0.8201388888888889 | 0 |
| 0.8208333333333333 | 0 |
| 0.8215277777777777 | 0 |
| 0.8222222222222223 | 0 |
| 0.8229166666666666 | 0 |
| 0.8236111111111111 | 0 |
| 0.8243055555555556 | 0 |
| 0.8250000000000001 | 0 |
| 0.8256944444444444 | 0 |
| 0.8263888888888888 | 0 |
| 0.8270833333333334 | 0 |
| 0.8277777777777778 | 0 |
| 0.8284722222222222 | 0 |
| 0.8291666666666666 | 0 |
| 0.8298611111111112 | 0 |
| 0.8305555555555556 | 0 |
| 0.8312499999999999 | 0 |
| 0.8319444444444444 | 0 |
| 0.8326388888888889 | 0 |
| 0.8333333333333334 | 0 |
| 0.8340277777777777 | 0 |
| 0.8347222222222223 | 0 |
| 0.8354166666666667 | 0 |
| 0.8361111111111111 | 0 |
| 0.8368055555555555 | 0 |
| 0.8375 | 0 |
| 0.8381944444444445 | 0 |
| 0.8388888888888889 | 0 |
| 0.8395833333333332 | 0 |
| 0.8402777777777778 | 0 |
| 0.8409722222222222 | 0 |
| 0.8416666666666667 | 0 |
| 0.842361111111111 | 0 |
| 0.8430555555555556 | 0 |
| 0.84375 | 0 |
| 0.8444444444444444 | 0 |
| 0.845138888888889 | 0 |
| 0.8458333333333333 | 0 |
| 0.8465277777777778 | 0 |
| 0.8472222222222222 | 0 |
| 0.8479166666666668 | 0 |
| 0.8486111111111111 | 0 |
| 0.8493055555555555 | 0 |
| 0.85 | 0 |
| 0.8506944444444445 | 0 |
| 0.8513888888888889 | 0 |
| 0.8520833333333333 | 0 |
| 0.8527777777777777 | 0 |
| 0.8534722222222223 | 0 |
| 0.8541666666666666 | 0 |
| 0.8548611111111111 | 0 |
| 0.8555555555555556 | 0 |
| 0.8562500000000001 | 0 |
| 0.8569444444444444 | 0 |
| 0.8576388888888888 | 0 |
| 0.8583333333333334 | 0 |
| 0.8590277777777778 | 0 |
| 0.8597222222222222 | 0 |
| 0.8604166666666666 | 0 |
| 0.8611111111111112 | 0 |
| 0.8618055555555556 | 0 |
| 0.8624999999999999 | 0 |
| 0.8631944444444444 | 0 |
| 0.8638888888888889 | 0 |
| 0.8645833333333334 | 0 |
| 0.8652777777777777 | 0 |
| 0.8659722222222223 | 0 |
| 0.8666666666666667 | 0 |
| 0.8673611111111111 | 0 |
| 0.8680555555555555 | 0 |
| 0.86875 | 0 |
| 0.8694444444444445 | 0 |
| 0.8701388888888889 | 0 |
| 0.8708333333333332 | 0 |
| 0.8715277777777778 | 0 |
| 0.8722222222222222 | 0 |
| 0.8729166666666667 | 0 |
| 0.873611111111111 | 0 |
| 0.8743055555555556 | 0 |
| 0.875 | 0 |
| 0.8756944444444444 | 0 |
| 0.876388888888889 | 0 |
| 0.8770833333333333 | 0 |
| 0.8777777777777778 | 0 |
| 0.8784722222222222 | 0 |
| 0.8791666666666668 | 0 |
| 0.8798611111111111 | 0 |
| 0.8805555555555555 | 0 |
| 0.88125 | 0 |
| 0.8819444444444445 | 0 |
| 0.8826388888888889 | 0 |
| 0.8833333333333333 | 0 |
| 0.8840277777777777 | 0 |
| 0.8847222222222223 | 0 |
| 0.8854166666666666 | 0 |
| 0.8861111111111111 | 0 |
| 0.8868055555555556 | 0 |
| 0.8875000000000001 | 0 |
| 0.8881944444444444 | 0 |
| 0.8888888888888888 | 0 |
| 0.8895833333333334 | 0 |
| 0.8902777777777778 | 0 |
| 0.8909722222222222 | 0 |
| 0.8916666666666666 | 0 |
| 0.8923611111111112 | 0 |
| 0.8930555555555556 | 0 |
| 0.8937499999999999 | 0 |
| 0.8944444444444444 | 0 |
| 0.8951388888888889 | 0 |
| 0.8958333333333334 | 0 |
| 0.8965277777777777 | 0 |
| 0.8972222222222223 | 0 |
| 0.8979166666666667 | 0 |
| 0.8986111111111111 | 0 |
| 0.8993055555555555 | 0 |
| 0.9 | 0 |
| 0.9006944444444445 | 0 |
| 0.9013888888888889 | 0 |
| 0.9020833333333332 | 0 |
| 0.9027777777777778 | 0 |
| 0.9034722222222222 | 0 |
| 0.9041666666666667 | 0 |
| 0.904861111111111 | 0 |
| 0.9055555555555556 | 0 |
| 0.90625 | 0 |
| 0.9069444444444444 | 0 |
| 0.907638888888889 | 0 |
| 0.9083333333333333 | 0 |
| 0.9090277777777778 | 0 |
| 0.9097222222222222 | 0 |
| 0.9104166666666668 | 0 |
| 0.9111111111111111 | 0 |
| 0.9118055555555555 | 0 |
| 0.9125 | 0 |
| 0.9131944444444445 | 0 |
| 0.9138888888888889 | 0 |
| 0.9145833333333333 | 0 |
| 0.9152777777777777 | 0 |
| 0.9159722222222223 | 0 |
| 0.9166666666666666 | 0 |
| 0.9173611111111111 | 0 |
| 0.9180555555555556 | 0 |
| 0.9187500000000001 | 0 |
| 0.9194444444444444 | 0 |
| 0.9201388888888888 | 0 |
| 0.9208333333333334 | 0 |
| 0.9215277777777778 | 0 |
| 0.9222222222222222 | 0 |
| 0.9229166666666666 | 0 |
| 0.9236111111111112 | 0 |
| 0.9243055555555556 | 0 |
| 0.9249999999999999 | 0 |
| 0.9256944444444444 | 0 |
| 0.9263888888888889 | 0 |
| 0.9270833333333334 | 0 |
| 0.9277777777777777 | 0 |
| 0.9284722222222223 | 0 |
| 0.9291666666666667 | 0 |
| 0.9298611111111111 | 0 |
| 0.9305555555555555 | 0 |
| 0.93125 | 0 |
| 0.9319444444444445 | 0 |
| 0.9326388888888889 | 0 |
| 0.9333333333333332 | 0 |
| 0.9340277777777778 | 0 |
| 0.9347222222222222 | 0 |
| 0.9354166666666667 | 0 |
| 0.936111111111111 | 0 |
| 0.9368055555555556 | 0 |
| 0.9375 | 0 |
| 0.9381944444444444 | 0 |
| 0.938888888888889 | 0 |
| 0.9395833333333333 | 0 |
| 0.9402777777777778 | 0 |
| 0.9409722222222222 | 0 |
| 0.9416666666666668 | 0 |
| 0.9423611111111111 | 0 |
| 0.9430555555555555 | 0 |
| 0.94375 | 0 |
| 0.9444444444444445 | 0 |
| 0.9451388888888889 | 0 |
| 0.9458333333333333 | 0 |
| 0.9465277777777777 | 0 |
| 0.9472222222222223 | 0 |
| 0.9479166666666666 | 0 |
| 0.9486111111111111 | 0 |
| 0.9493055555555556 | 0 |
| 0.9500000000000001 | 0 |
| 0.9506944444444444 | 0 |
| 0.9513888888888888 | 0 |
| 0.9520833333333334 | 0 |
| 0.9527777777777778 | 0 |
| 0.9534722222222222 | 0 |
| 0.9541666666666666 | 0 |
| 0.9548611111111112 | 0 |
| 0.9555555555555556 | 0 |
| 0.9562499999999999 | 0 |
| 0.9569444444444444 | 0 |
| 0.9576388888888889 | 0 |
| 0.9583333333333334 | 0 |
| 0.9590277777777777 | 0 |
| 0.9597222222222223 | 0 |
| 0.9604166666666667 | 0 |
| 0.9611111111111111 | 0 |
| 0.9618055555555555 | 0 |
| 0.9625 | 0 |
| 0.9631944444444445 | 0 |
| 0.9638888888888889 | 0 |
| 0.9645833333333332 | 0 |
| 0.9652777777777778 | 0 |
| 0.9659722222222222 | 0 |
| 0.9666666666666667 | 0 |
| 0.967361111111111 | 0 |
| 0.9680555555555556 | 0 |
| 0.96875 | 0 |
| 0.9694444444444444 | 0 |
| 0.970138888888889 | 0 |
| 0.9708333333333333 | 0 |
| 0.9715277777777778 | 0 |
| 0.9722222222222222 | 0 |
| 0.9729166666666668 | 0 |
| 0.9736111111111111 | 0 |
| 0.9743055555555555 | 0 |
| 0.975 | 0 |
| 0.9756944444444445 | 0 |
| 0.9763888888888889 | 0 |
| 0.9770833333333333 | 0 |
| 0.9777777777777777 | 0 |
| 0.9784722222222223 | 0 |
| 0.9791666666666666 | 0 |
| 0.9798611111111111 | 0 |
| 0.9805555555555556 | 0 |
| 0.9812500000000001 | 0 |
| 0.9819444444444444 | 0 |
| 0.9826388888888888 | 0 |
| 0.9833333333333334 | 0 |
| 0.9840277777777778 | 0 |
| 0.9847222222222222 | 0 |
| 0.9854166666666666 | 0 |
| 0.9861111111111112 | 0 |
| 0.9868055555555556 | 0 |
| 0.9874999999999999 | 0 |
| 0.9881944444444444 | 0 |
| 0.9888888888888889 | 0 |
| 0.9895833333333334 | 0 |
| 0.9902777777777777 | 0 |
| 0.9909722222222223 | 0 |
| 0.9916666666666667 | 0 |
| 0.9923611111111111 | 0 |
| 0.9930555555555555 | 0 |
| 0.99375 | 0 |
| 0.9944444444444445 | 0 |
| 0.9951388888888889 | 0 |
| 0.9958333333333332 | 0 |
| 0.9965277777777778 | 0 |
| 0.9972222222222222 | 0 |
| 0.9979166666666667 | 0 |
| 0.998611111111111 | 0 |
| 0.9993055555555556 | 0 |